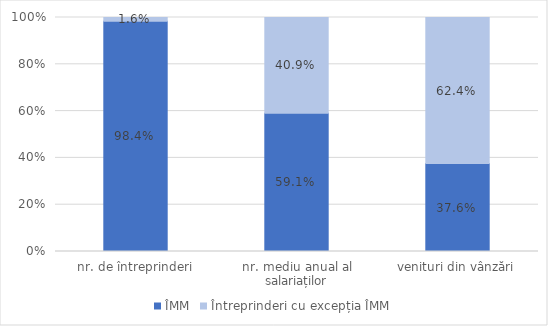
| Category | ÎMM | Întreprinderi cu excepția ÎMM |
|---|---|---|
| nr. de întreprinderi | 0.984 | 0.016 |
| nr. mediu anual al salariaților | 0.591 | 0.409 |
| venituri din vânzări | 0.376 | 0.624 |